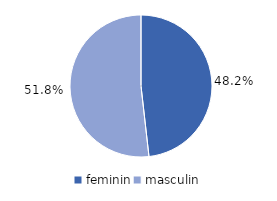
| Category | Series 0 |
|---|---|
| feminin | 48.2 |
| masculin | 51.8 |